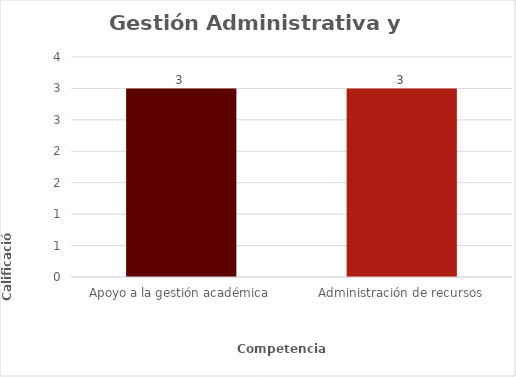
| Category | Series 0 |
|---|---|
| Apoyo a la gestión académica | 3 |
| Administración de recursos | 3 |